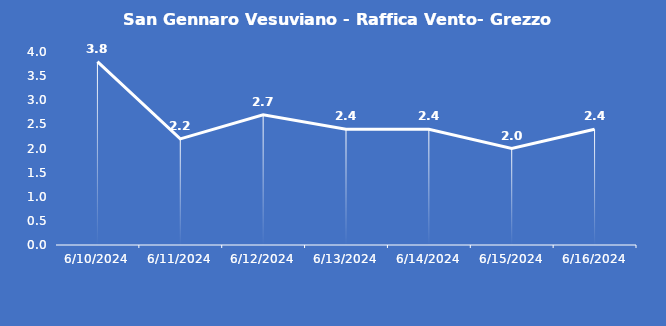
| Category | San Gennaro Vesuviano - Raffica Vento- Grezzo (m/s) |
|---|---|
| 6/10/24 | 3.8 |
| 6/11/24 | 2.2 |
| 6/12/24 | 2.7 |
| 6/13/24 | 2.4 |
| 6/14/24 | 2.4 |
| 6/15/24 | 2 |
| 6/16/24 | 2.4 |